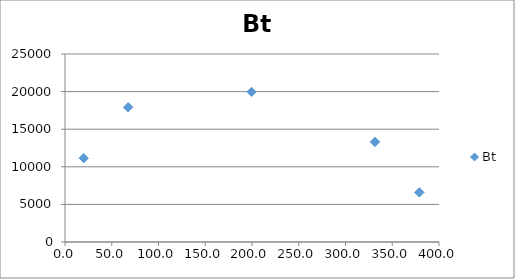
| Category | Bt |
|---|---|
| 20.0 | 11147.075 |
| 20.0 | 11145.848 |
| 67.5 | 17917.168 |
| 67.5 | 17915.637 |
| 199.5 | 19963.935 |
| 199.5 | 19964.134 |
| 331.5 | 13310.015 |
| 331.5 | 13311.426 |
| 379.0 | 6597.617 |
| 379.0 | 6599.213 |